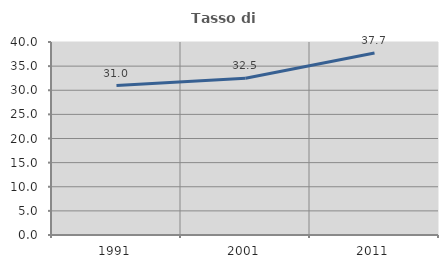
| Category | Tasso di occupazione   |
|---|---|
| 1991.0 | 30.964 |
| 2001.0 | 32.484 |
| 2011.0 | 37.71 |